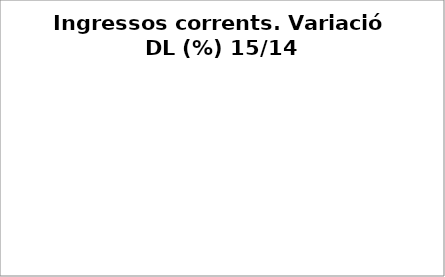
| Category | Series 0 |
|---|---|
| Impostos locals | 0.061 |
| Participació Tributs de l'Estat | 0.01 |
| Taxes i altres ingressos | -0.009 |
| Transferències corrents (exc. FCF) | 0.861 |
| Ingressos patrimonials | 0.359 |
| Ingressos corrents | 0.063 |